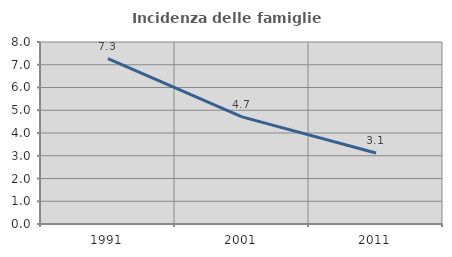
| Category | Incidenza delle famiglie numerose |
|---|---|
| 1991.0 | 7.265 |
| 2001.0 | 4.71 |
| 2011.0 | 3.12 |